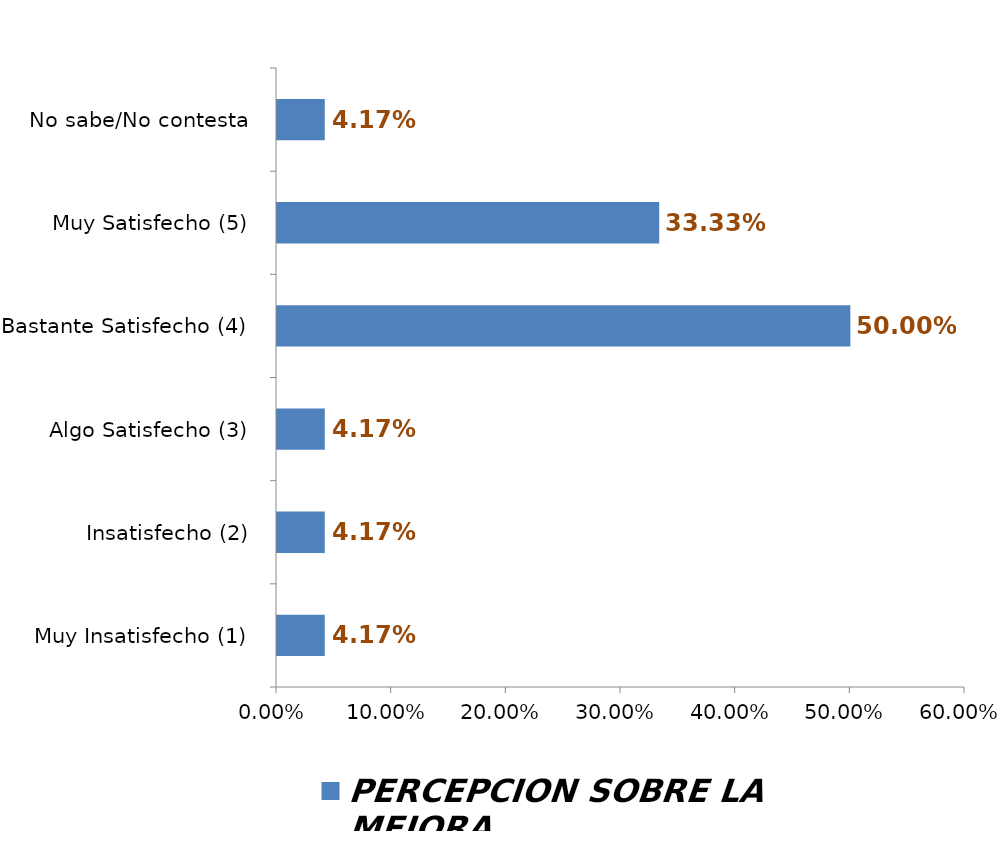
| Category | PERCEPCIÓN SOBRE LA MEJORA |
|---|---|
| Muy Insatisfecho (1) | 0.042 |
| Insatisfecho (2) | 0.042 |
| Algo Satisfecho (3) | 0.042 |
| Bastante Satisfecho (4) | 0.5 |
| Muy Satisfecho (5) | 0.333 |
| No sabe/No contesta | 0.042 |